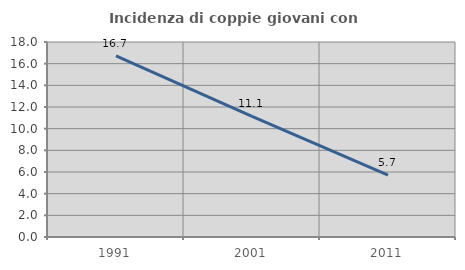
| Category | Incidenza di coppie giovani con figli |
|---|---|
| 1991.0 | 16.719 |
| 2001.0 | 11.143 |
| 2011.0 | 5.722 |